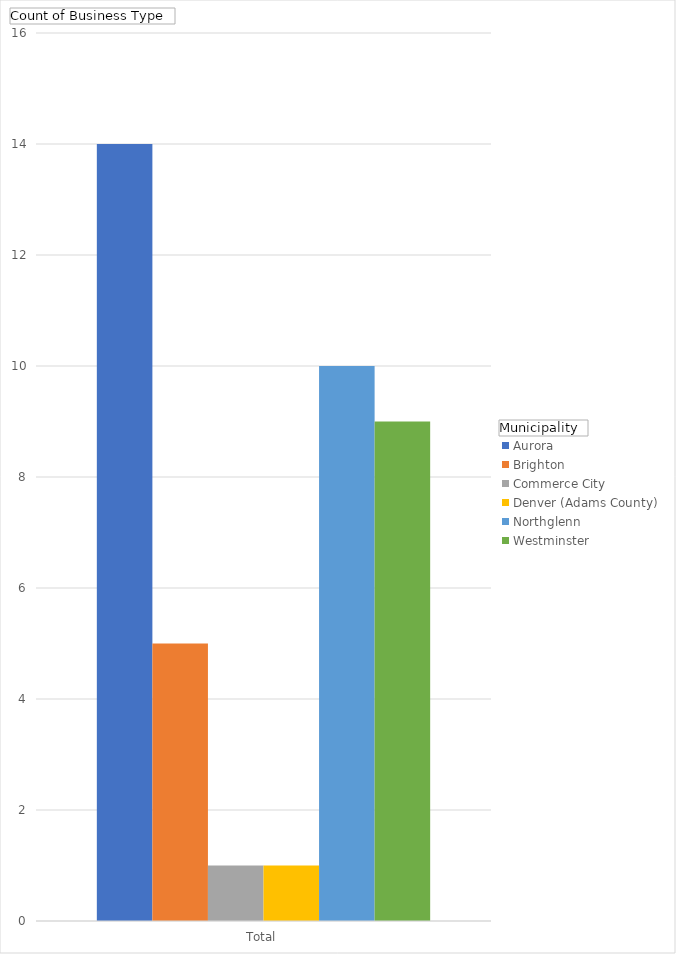
| Category | Aurora | Brighton | Commerce City | Denver (Adams County) | Northglenn | Westminster |
|---|---|---|---|---|---|---|
| Total | 14 | 5 | 1 | 1 | 10 | 9 |